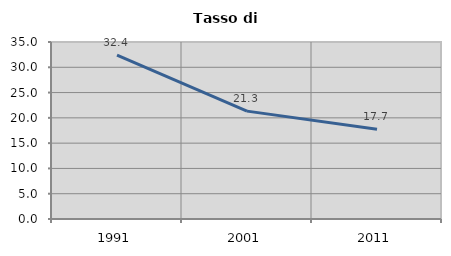
| Category | Tasso di disoccupazione   |
|---|---|
| 1991.0 | 32.407 |
| 2001.0 | 21.33 |
| 2011.0 | 17.736 |